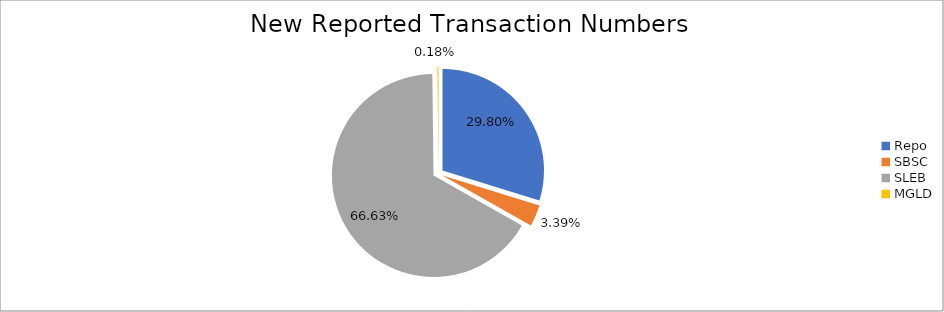
| Category | Series 0 |
|---|---|
| Repo | 392294 |
| SBSC | 44631 |
| SLEB | 877299 |
| MGLD | 2397 |